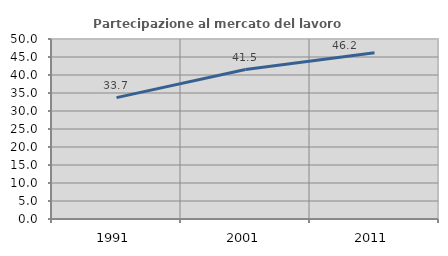
| Category | Partecipazione al mercato del lavoro  femminile |
|---|---|
| 1991.0 | 33.714 |
| 2001.0 | 41.512 |
| 2011.0 | 46.195 |